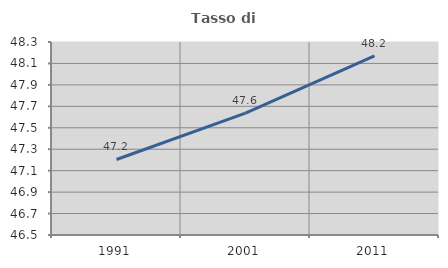
| Category | Tasso di occupazione   |
|---|---|
| 1991.0 | 47.204 |
| 2001.0 | 47.637 |
| 2011.0 | 48.17 |